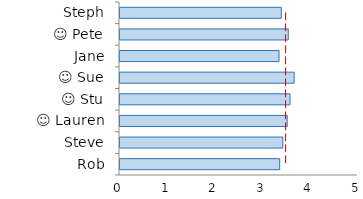
| Category | Series 0 | Series 1 |
|---|---|---|
| Steph | 3.389 | 3.5 |
|  ☺ Pete | 3.535 | 3.5 |
| Jane | 3.341 | 3.5 |
|  ☺ Sue | 3.659 | 3.5 |
|  ☺ Stu | 3.571 | 3.5 |
|  ☺ Lauren | 3.513 | 3.5 |
| Steve | 3.421 | 3.5 |
| Rob | 3.355 | 3.5 |